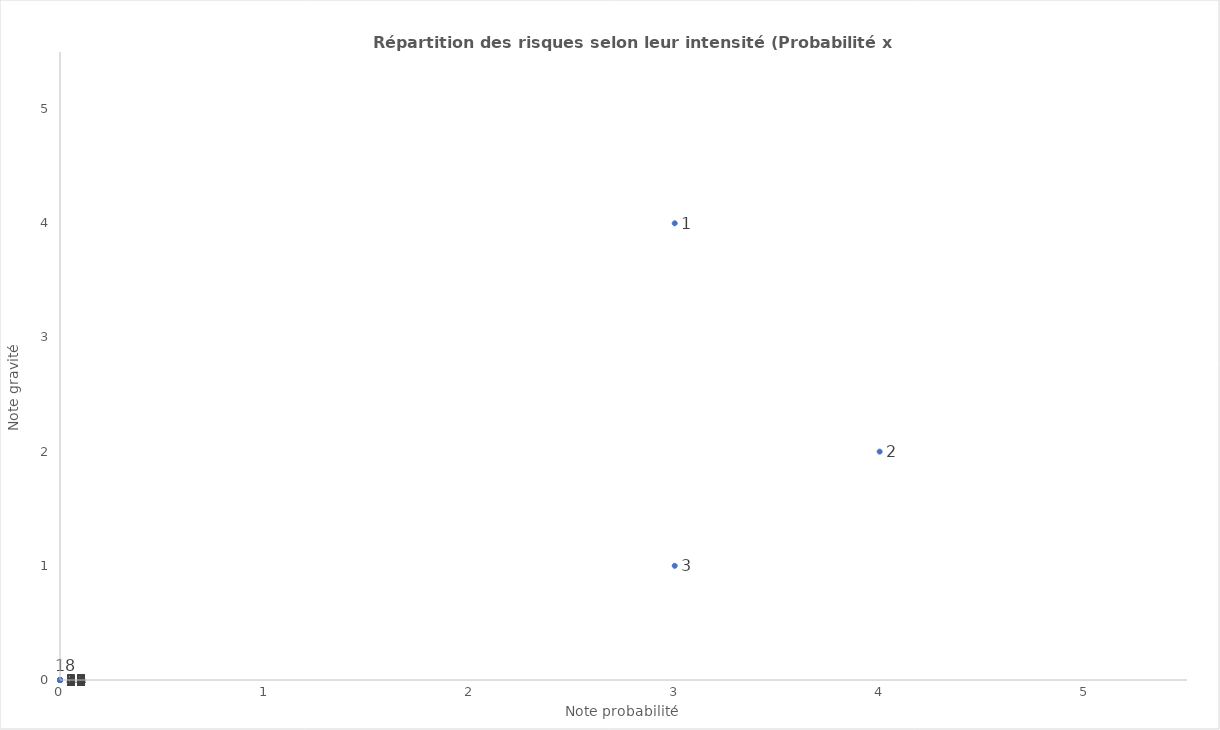
| Category | Intensité du risque |
|---|---|
| 3.0 | 4 |
| 4.0 | 2 |
| 3.0 | 1 |
| 0.0 | 0 |
| 0.0 | 0 |
| 0.0 | 0 |
| 0.0 | 0 |
| 0.0 | 0 |
| 0.0 | 0 |
| 0.0 | 0 |
| 0.0 | 0 |
| 0.0 | 0 |
| 0.0 | 0 |
| 0.0 | 0 |
| 0.0 | 0 |
| 0.0 | 0 |
| 0.0 | 0 |
| 0.0 | 0 |
| 0.0 | 0 |
| 0.0 | 0 |
| 0.0 | 0 |
| 0.0 | 0 |
| 0.0 | 0 |
| 0.0 | 0 |
| 0.0 | 0 |
| 0.0 | 0 |
| 0.0 | 0 |
| 0.0 | 0 |
| 0.0 | 0 |
| 0.0 | 0 |
| 0.0 | 0 |
| 0.0 | 0 |
| 0.0 | 0 |
| 0.0 | 0 |
| 0.0 | 0 |
| 0.0 | 0 |
| 0.0 | 0 |
| 0.0 | 0 |
| 0.0 | 0 |
| 0.0 | 0 |